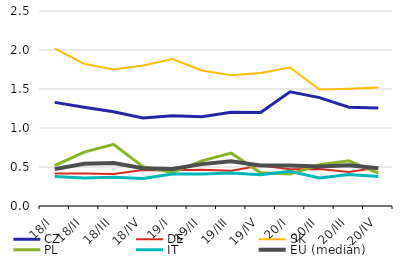
| Category | CZ | DE | SK | PL | IT | EU (medián) |
|---|---|---|---|---|---|---|
| 18/I | 1.328 | 0.415 | 2.019 | 0.517 | 0.378 | 0.473 |
| 18/II | 1.266 | 0.418 | 1.823 | 0.692 | 0.36 | 0.54 |
| 18/III | 1.207 | 0.41 | 1.751 | 0.79 | 0.367 | 0.551 |
| 18/IV | 1.129 | 0.461 | 1.801 | 0.504 | 0.353 | 0.483 |
| 19/I | 1.158 | 0.458 | 1.884 | 0.431 | 0.409 | 0.473 |
| 19/II | 1.144 | 0.464 | 1.737 | 0.578 | 0.41 | 0.537 |
| 19/III | 1.201 | 0.451 | 1.677 | 0.677 | 0.424 | 0.575 |
| 19/IV | 1.197 | 0.518 | 1.705 | 0.427 | 0.401 | 0.518 |
| 20/I | 1.464 | 0.471 | 1.775 | 0.409 | 0.444 | 0.518 |
| 20/II | 1.39 | 0.475 | 1.493 | 0.529 | 0.359 | 0.508 |
| 20/III | 1.267 | 0.437 | 1.504 | 0.58 | 0.403 | 0.522 |
| 20/IV | 1.257 | 0.494 | 1.519 | 0.421 | 0.378 | 0.485 |